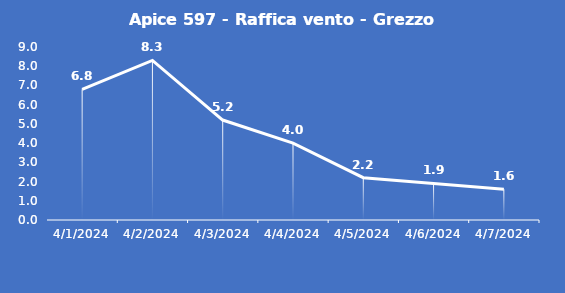
| Category | Apice 597 - Raffica vento - Grezzo (m/s) |
|---|---|
| 4/1/24 | 6.8 |
| 4/2/24 | 8.3 |
| 4/3/24 | 5.2 |
| 4/4/24 | 4 |
| 4/5/24 | 2.2 |
| 4/6/24 | 1.9 |
| 4/7/24 | 1.6 |